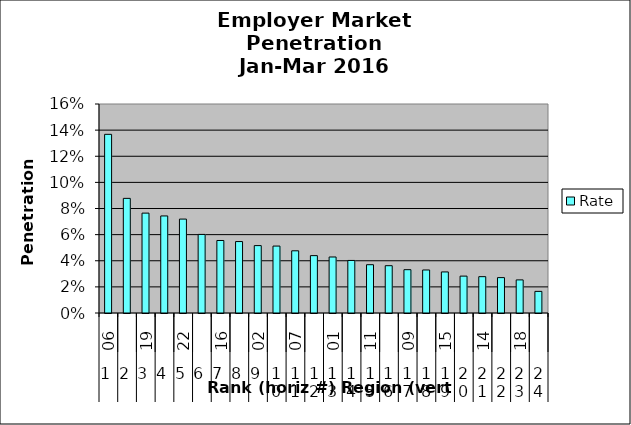
| Category | Rate |
|---|---|
| 0 | 0.137 |
| 1 | 0.088 |
| 2 | 0.076 |
| 3 | 0.074 |
| 4 | 0.072 |
| 5 | 0.06 |
| 6 | 0.056 |
| 7 | 0.055 |
| 8 | 0.052 |
| 9 | 0.051 |
| 10 | 0.048 |
| 11 | 0.044 |
| 12 | 0.043 |
| 13 | 0.04 |
| 14 | 0.037 |
| 15 | 0.036 |
| 16 | 0.033 |
| 17 | 0.033 |
| 18 | 0.031 |
| 19 | 0.028 |
| 20 | 0.028 |
| 21 | 0.027 |
| 22 | 0.025 |
| 23 | 0.017 |